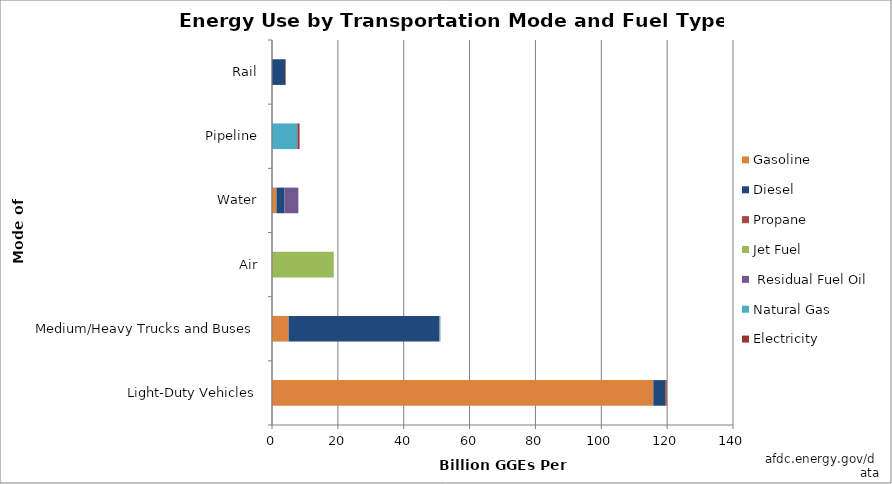
| Category | Gasoline | Diesel | Propane | Jet Fuel |  Residual Fuel Oil | Natural Gas | Electricity |
|---|---|---|---|---|---|---|---|
| Light-Duty Vehicles | 115.799 | 3.595 | 0.438 | 0 | 0 | 0 | 0.111 |
| Medium/Heavy Trucks and Buses | 5.046 | 45.739 | 0.165 | 0 | 0 | 0.211 | 0.002 |
| Air | 0.179 | 0 | 0 | 18.567 | 0 | 0 | 0 |
| Water | 1.36 | 2.448 | 0 | 0 | 4.196 | 0 | 0 |
| Pipeline | 0 | 0 | 0 | 0 | 0 | 7.7 | 0.669 |
| Rail | 0 | 3.978 | 0 | 0 | 0 | 0 | 0.195 |